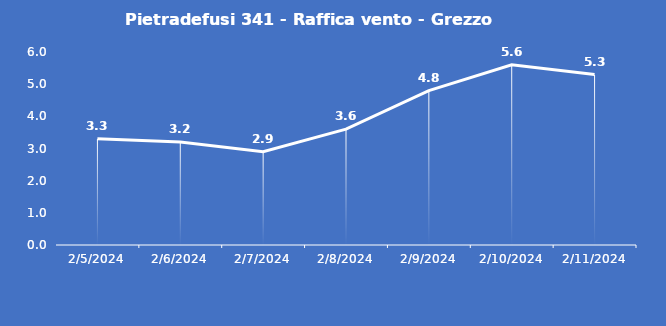
| Category | Pietradefusi 341 - Raffica vento - Grezzo (m/s) |
|---|---|
| 2/5/24 | 3.3 |
| 2/6/24 | 3.2 |
| 2/7/24 | 2.9 |
| 2/8/24 | 3.6 |
| 2/9/24 | 4.8 |
| 2/10/24 | 5.6 |
| 2/11/24 | 5.3 |